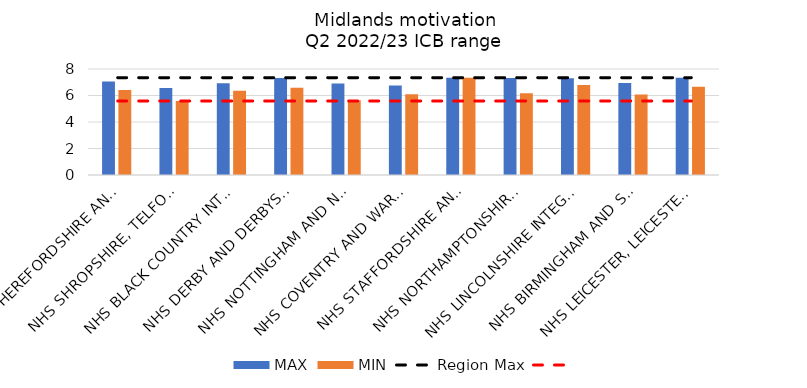
| Category | MAX | MIN |
|---|---|---|
| NHS HEREFORDSHIRE AND WORCESTERSHIRE INTEGRATED CARE BOARD | 7.054 | 6.419 |
| NHS SHROPSHIRE, TELFORD AND WREKIN INTEGRATED CARE BOARD | 6.561 | 5.583 |
| NHS BLACK COUNTRY INTEGRATED CARE BOARD | 6.926 | 6.357 |
| NHS DERBY AND DERBYSHIRE INTEGRATED CARE BOARD | 7.326 | 6.576 |
| NHS NOTTINGHAM AND NOTTINGHAMSHIRE INTEGRATED CARE BOARD | 6.906 | 5.649 |
| NHS COVENTRY AND WARWICKSHIRE INTEGRATED CARE BOARD | 6.757 | 6.093 |
| NHS STAFFORDSHIRE AND STOKE-ON-TRENT INTEGRATED CARE BOARD | 7.344 | 7.344 |
| NHS NORTHAMPTONSHIRE INTEGRATED CARE BOARD | 7.315 | 6.163 |
| NHS LINCOLNSHIRE INTEGRATED CARE BOARD | 7.305 | 6.799 |
| NHS BIRMINGHAM AND SOLIHULL INTEGRATED CARE BOARD | 6.944 | 6.067 |
| NHS LEICESTER, LEICESTERSHIRE AND RUTLAND INTEGRATED CARE BOARD | 7.347 | 6.651 |